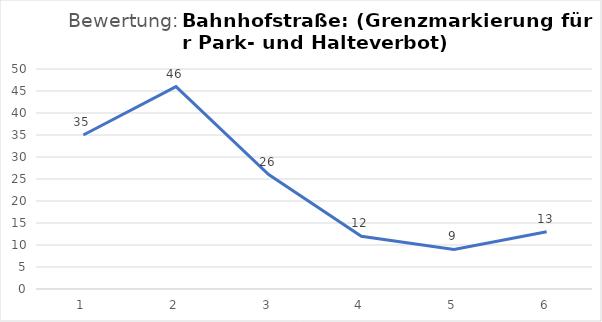
| Category | Series 0 |
|---|---|
| 1.0 | 35 |
| 2.0 | 46 |
| 3.0 | 26 |
| 4.0 | 12 |
| 5.0 | 9 |
| 6.0 | 13 |